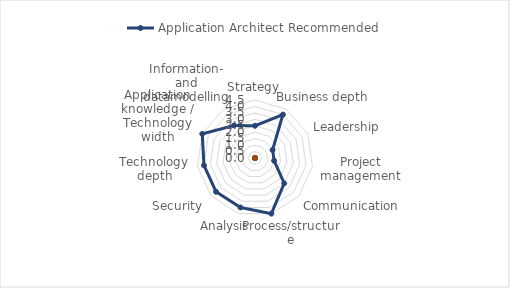
| Category | Application Architect |
|---|---|
| Strategy |  |
| Business depth |  |
| Leadership |  |
| Project management |  |
| Communication |  |
| Process/structure |  |
| Analysis |  |
| Security |  |
| Technology depth |  |
| Application knowledge / Technology width |  |
| Information- and datamodelling |  |